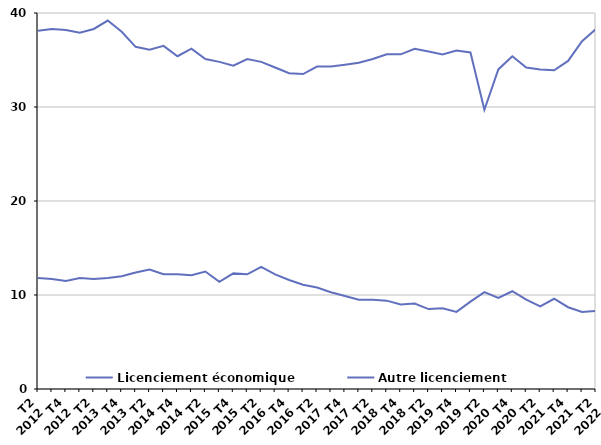
| Category | Licenciement économique | Autre licenciement |
|---|---|---|
| T2
2012 | 11.8 | 38.1 |
| T3
2012 | 11.7 | 38.3 |
| T4
2012 | 11.5 | 38.2 |
| T1
2013 | 11.8 | 37.9 |
| T2
2013 | 11.7 | 38.3 |
| T3
2013 | 11.8 | 39.2 |
| T4
2013 | 12 | 38 |
| T1
2014 | 12.4 | 36.4 |
| T2
2014 | 12.7 | 36.1 |
| T3
2014 | 12.2 | 36.5 |
| T4
2014 | 12.2 | 35.4 |
| T1
2015 | 12.1 | 36.2 |
| T2
2015 | 12.5 | 35.1 |
| T3
2015 | 11.4 | 34.8 |
| T4
2015 | 12.3 | 34.4 |
| T1
2016 | 12.2 | 35.1 |
| T2
2016 | 13 | 34.8 |
| T3
2016 | 12.2 | 34.2 |
| T4
2016 | 11.6 | 33.6 |
| T1
2017 | 11.1 | 33.5 |
| T2
2017 | 10.8 | 34.3 |
| T3
2017 | 10.3 | 34.3 |
| T4
2017 | 9.9 | 34.5 |
| T1
2018 | 9.5 | 34.7 |
| T2
2018 | 9.5 | 35.1 |
| T3
2018 | 9.4 | 35.6 |
| T4
2018 | 9 | 35.6 |
| T1
2019 | 9.1 | 36.2 |
| T2
2019 | 8.5 | 35.9 |
| T3
2019 | 8.6 | 35.6 |
| T4
2019 | 8.2 | 36 |
| T1
2020 | 9.3 | 35.8 |
| T2
2020 | 10.3 | 29.7 |
| T3
2020 | 9.7 | 34 |
| T4
2020 | 10.4 | 35.4 |
| T1
2021 | 9.5 | 34.2 |
| T2
2021 | 8.8 | 34 |
| T3
2021 | 9.6 | 33.9 |
| T4
2021 | 8.7 | 34.9 |
| T1
2022 | 8.2 | 37 |
| T2
2022 | 8.3 | 38.3 |